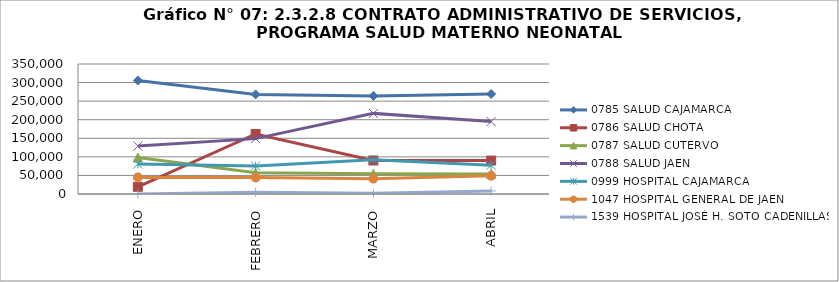
| Category | 0785 SALUD CAJAMARCA | 0786 SALUD CHOTA | 0787 SALUD CUTERVO | 0788 SALUD JAEN | 0999 HOSPITAL CAJAMARCA | 1047 HOSPITAL GENERAL DE JAEN | 1539 HOSPITAL JOSÉ H. SOTO CADENILLAS |
|---|---|---|---|---|---|---|---|
| ENERO | 305661 | 19359 | 98062 | 128989 | 80602 | 44718 | 0 |
| FEBRERO | 268152 | 161605 | 57073 | 149094 | 75255 | 44190 | 4704 |
| MARZO | 264160 | 90205 | 54222 | 217050 | 92028 | 41290 | 1704 |
| ABRIL | 269147 | 89969 | 53847 | 194996 | 77353 | 49186 | 8224 |